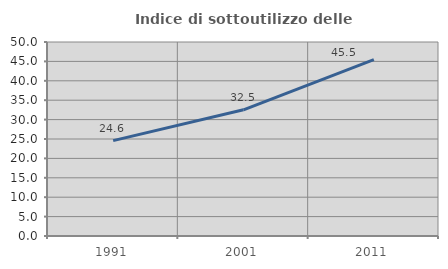
| Category | Indice di sottoutilizzo delle abitazioni  |
|---|---|
| 1991.0 | 24.59 |
| 2001.0 | 32.525 |
| 2011.0 | 45.455 |